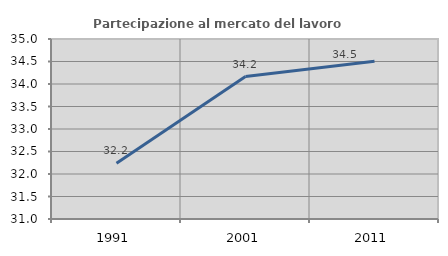
| Category | Partecipazione al mercato del lavoro  femminile |
|---|---|
| 1991.0 | 32.24 |
| 2001.0 | 34.164 |
| 2011.0 | 34.505 |